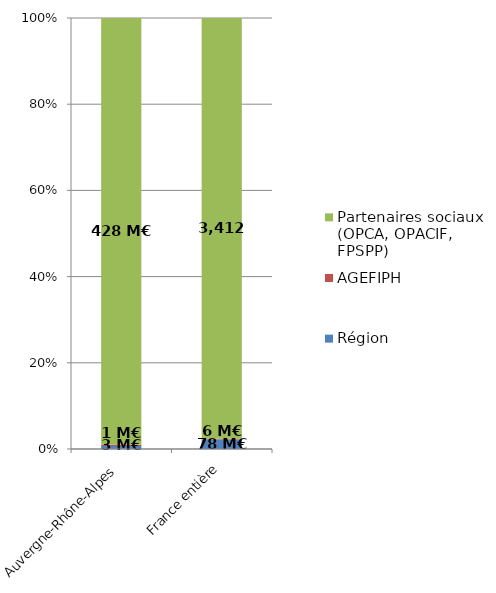
| Category | Région | AGEFIPH | Partenaires sociaux (OPCA, OPACIF, FPSPP) |
|---|---|---|---|
| Auvergne-Rhône-Alpes | 3.069 | 1.116 | 428.268 |
| France entière | 77.612 | 6.161 | 3411.683 |